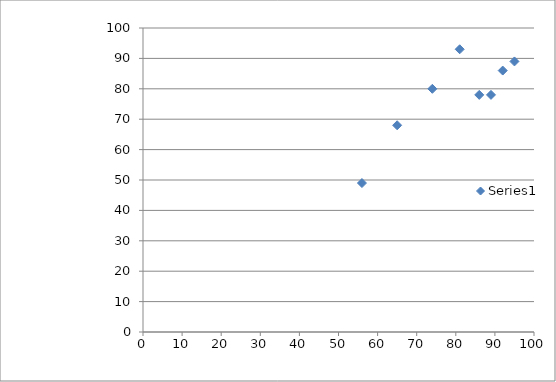
| Category | Series 0 |
|---|---|
| 81.0 | 93 |
| 86.0 | 78 |
| 95.0 | 89 |
| 65.0 | 68 |
| 56.0 | 49 |
| 89.0 | 78 |
| 74.0 | 80 |
| 92.0 | 86 |